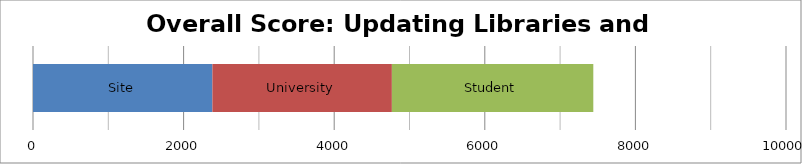
| Category | Site | University | Student |
|---|---|---|---|
| 0 | 2382.5 | 2383.5 | 2675 |